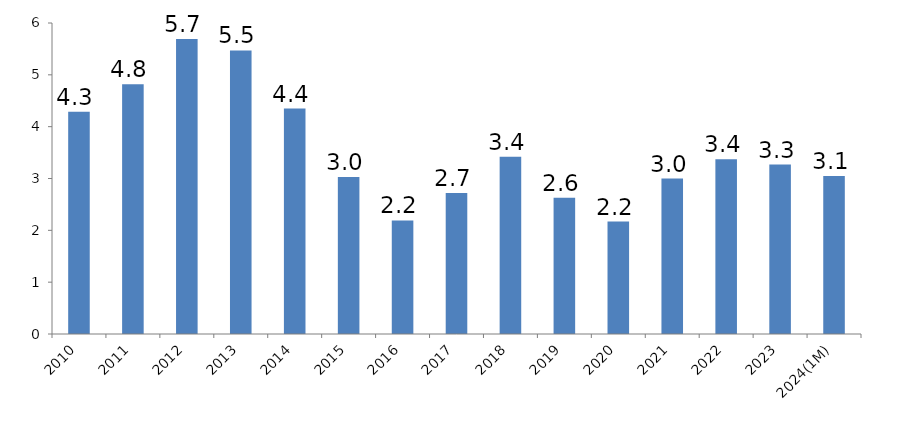
| Category | Value of Exported Energy : Total Export (%) |
|---|---|
| 2010 | 4.29 |
| 2011 | 4.82 |
| 2012 | 5.69 |
| 2013 | 5.47 |
| 2014 | 4.35 |
| 2015 | 3.03 |
| 2016 | 2.19 |
| 2017 | 2.72 |
| 2018 | 3.42 |
| 2019 | 2.63 |
| 2020 | 2.17 |
| 2021 | 3 |
| 2022 | 3.37 |
| 2023 | 3.27 |
| 2024(1M) | 3.05 |